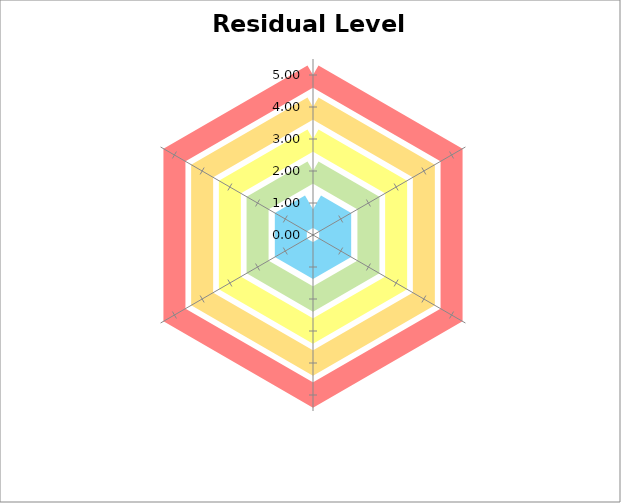
| Category | B | G | Y | O | R |
|---|---|---|---|---|---|
| Data subject | 0.8 | 2 | 3 | 4 | 5 |
| Processor | 0.8 | 2 | 3 | 4 | 5 |
| Controller | 0.8 | 2 | 3 | 4 | 5 |
| The processing (systems and related processes)   | 0.8 | 2 | 3 | 4 | 5 |
| Data transfer (third party & international) | 0.8 | 2 | 3 | 4 | 5 |
| De GDPR (continue) governance (Law, guidelines, rules) | 0.8 | 2 | 3 | 4 | 5 |